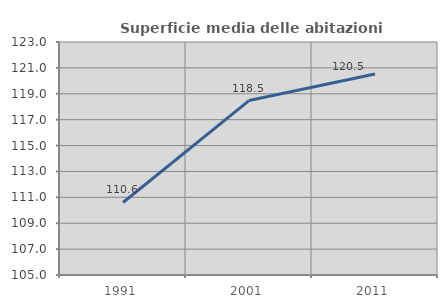
| Category | Superficie media delle abitazioni occupate |
|---|---|
| 1991.0 | 110.602 |
| 2001.0 | 118.477 |
| 2011.0 | 120.525 |